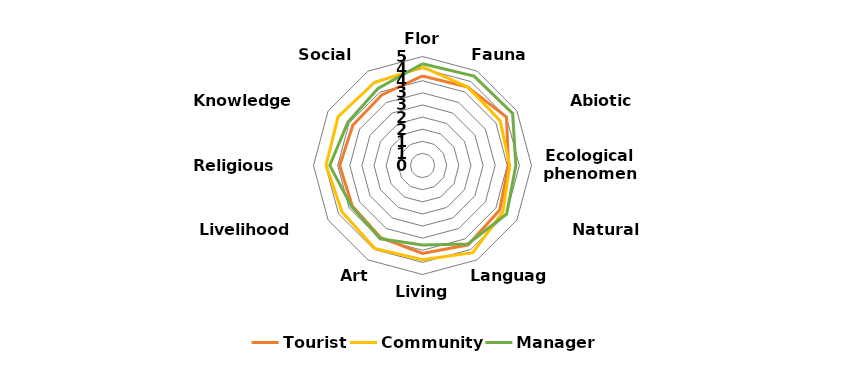
| Category | Tourist | Community | Manager |
|---|---|---|---|
| Flora | 3.698 | 4.067 | 4.201 |
| Fauna | 3.739 | 3.74 | 4.26 |
| Abiotic component | 4.002 | 3.7 | 4.297 |
| Ecological phenomena | 3.552 | 3.602 | 3.854 |
| Natural phenomena | 3.68 | 3.834 | 4.009 |
| Language | 3.779 | 4.157 | 3.744 |
| Living equipment | 3.633 | 3.886 | 3.284 |
| Art | 3.442 | 3.95 | 3.491 |
| Livelihood system | 3.348 | 3.833 | 3.384 |
| Religious system | 3.419 | 3.979 | 3.828 |
| Knowledge system | 3.322 | 4.026 | 3.562 |
| Social system | 3.363 | 3.959 | 3.672 |